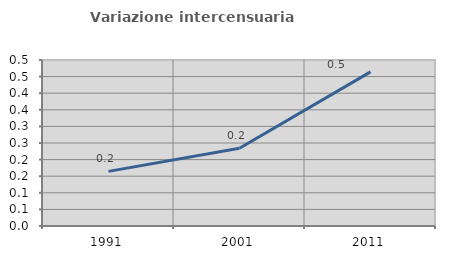
| Category | Variazione intercensuaria annua |
|---|---|
| 1991.0 | 0.165 |
| 2001.0 | 0.234 |
| 2011.0 | 0.464 |